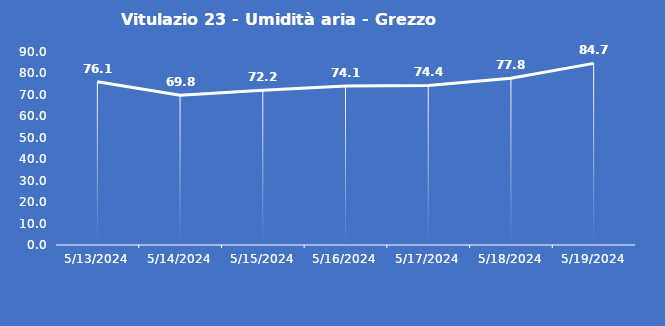
| Category | Vitulazio 23 - Umidità aria - Grezzo (%) |
|---|---|
| 5/13/24 | 76.1 |
| 5/14/24 | 69.8 |
| 5/15/24 | 72.2 |
| 5/16/24 | 74.1 |
| 5/17/24 | 74.4 |
| 5/18/24 | 77.8 |
| 5/19/24 | 84.7 |